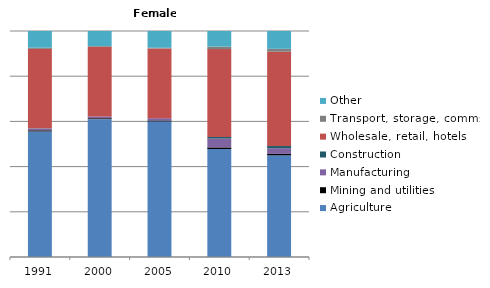
| Category | Agriculture | Mining and utilities | Manufacturing | Construction | Wholesale, retail, hotels | Transport, storage, comms | Other |
|---|---|---|---|---|---|---|---|
| 1991.0 | 55.5 | 0.5 | 0.8 | 0.1 | 35.1 | 0.5 | 7.4 |
| 2000.0 | 61 | 0.4 | 0.8 | 0 | 30.8 | 0.3 | 6.7 |
| 2005.0 | 59.9 | 0.4 | 1 | 0 | 30.8 | 0.3 | 7.4 |
| 2010.0 | 47.7 | 0.7 | 3.9 | 0.7 | 38.8 | 1.1 | 6.9 |
| 2013.0 | 45.1 | 0.6 | 2.5 | 1 | 41.8 | 1.3 | 7.9 |